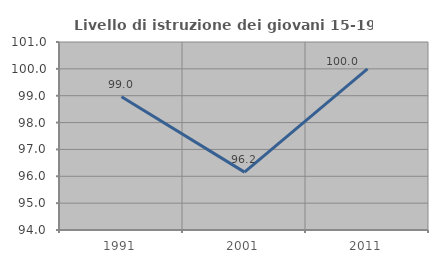
| Category | Livello di istruzione dei giovani 15-19 anni |
|---|---|
| 1991.0 | 98.958 |
| 2001.0 | 96.154 |
| 2011.0 | 100 |